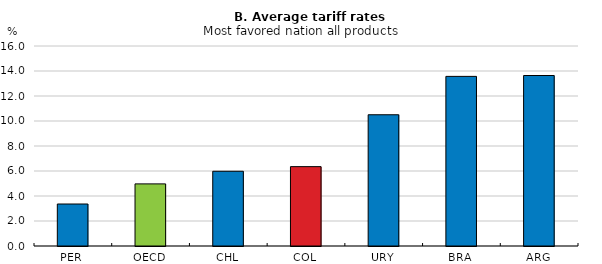
| Category | Tariff rate, most favored nation, simple mean, all products (%) |
|---|---|
| PER | 3.36 |
| OECD | 4.97 |
| CHL | 5.98 |
| COL | 6.35 |
| URY | 10.5 |
| BRA | 13.57 |
| ARG | 13.64 |